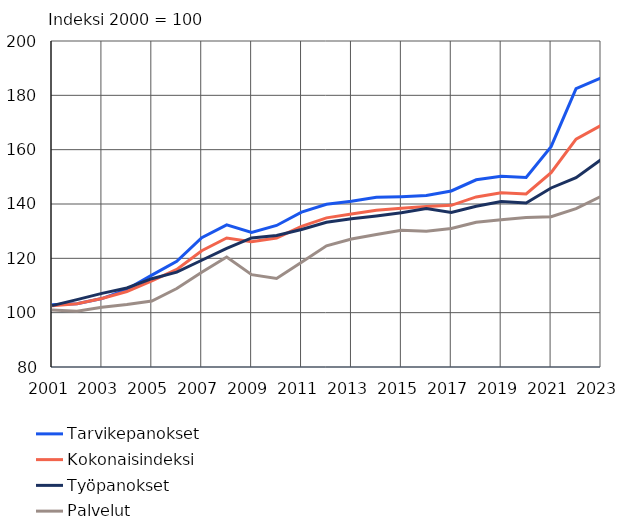
| Category | Tarvikepanokset | Kokonaisindeksi | Työpanokset | Palvelut |
|---|---|---|---|---|
| 2001.0 | 102.9 | 102.5 | 102.6 | 101 |
| 2002.0 | 103.3 | 103.3 | 104.8 | 100.5 |
| 2003.0 | 105.2 | 105.2 | 107.1 | 102 |
| 2004.0 | 108.6 | 107.8 | 109.1 | 103 |
| 2005.0 | 113.8 | 111.7 | 112.5 | 104.3 |
| 2006.0 | 118.9 | 115.9 | 114.9 | 108.9 |
| 2007.0 | 127.6 | 122.8 | 119.3 | 114.9 |
| 2008.0 | 132.3 | 127.5 | 123.7 | 120.5 |
| 2009.0 | 129.5 | 126.1 | 127.5 | 114 |
| 2010.0 | 132.1 | 127.5 | 128.4 | 112.6 |
| 2011.0 | 137 | 131.8 | 130.6 | 118.6 |
| 2012.0 | 139.9 | 134.9 | 133.3 | 124.6 |
| 2013.0 | 141 | 136.3 | 134.6 | 127.1 |
| 2014.0 | 142.5 | 137.7 | 135.6 | 128.8 |
| 2015.0 | 142.7 | 138.4 | 136.8 | 130.3 |
| 2016.0 | 143.1 | 139.1 | 138.3 | 130 |
| 2017.0 | 144.8 | 139.5 | 136.9 | 131 |
| 2018.0 | 148.9 | 142.6 | 139.2 | 133.3 |
| 2019.0 | 150.2 | 144.1 | 140.9 | 134.2 |
| 2020.0 | 149.8 | 143.7 | 140.4 | 135 |
| 2021.0 | 161.1 | 151.5 | 145.9 | 135.3 |
| 2022.0 | 182.5 | 163.9 | 149.7 | 138.3 |
| 2023.0 | 186.4 | 168.9 | 156.3 | 142.8 |